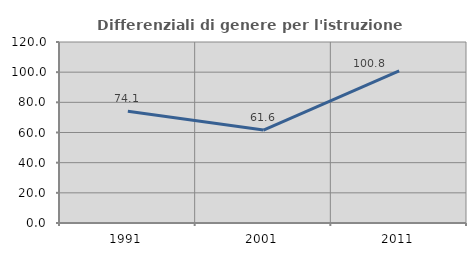
| Category | Differenziali di genere per l'istruzione superiore |
|---|---|
| 1991.0 | 74.124 |
| 2001.0 | 61.607 |
| 2011.0 | 100.815 |